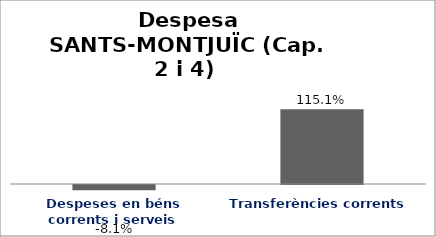
| Category | Series 0 |
|---|---|
| Despeses en béns corrents i serveis | -0.081 |
| Transferències corrents | 1.151 |